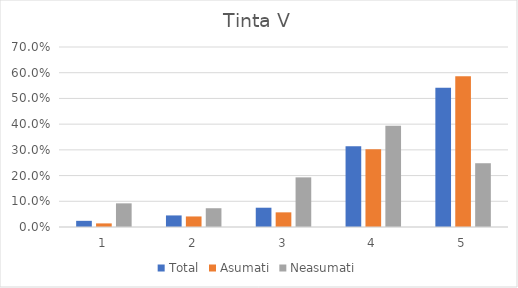
| Category | Total | Asumati | Neasumati |
|---|---|---|---|
| 0 | 0.024 | 0.014 | 0.092 |
| 1 | 0.045 | 0.041 | 0.073 |
| 2 | 0.075 | 0.057 | 0.193 |
| 3 | 0.314 | 0.302 | 0.394 |
| 4 | 0.542 | 0.586 | 0.248 |